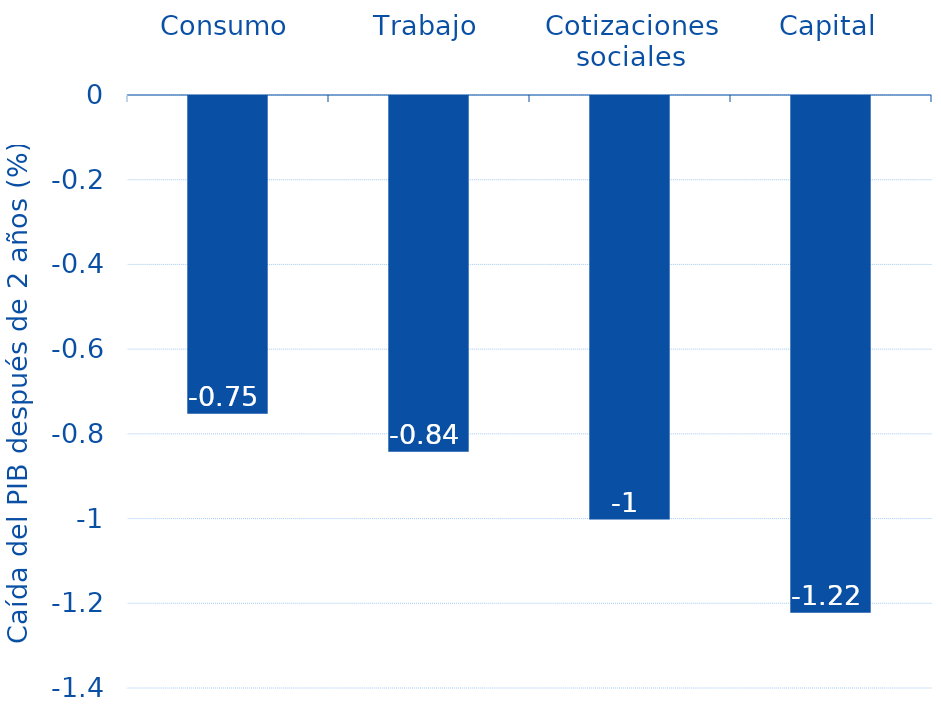
| Category | Series 0 |
|---|---|
| _x0007_Consumo | -0.75 |
| _x0007_Trabajo | -0.84 |
| _x0015_Cotizaciones sociales | -1 |
| _x0007_Capital | -1.22 |